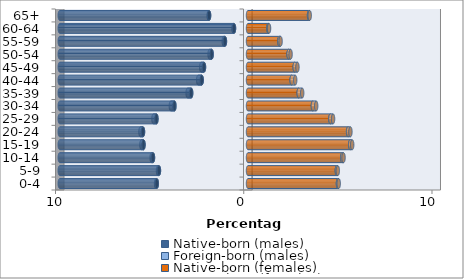
| Category | Native-born (males) | Foreign-born (males) | Native-born (females) | Foreign-born (females) |
|---|---|---|---|---|
| 0-4 | -4.845 | -0.04 | 4.778 | 0.042 |
| 5-9 | -4.73 | -0.051 | 4.719 | 0.052 |
| 10-14 | -5.048 | -0.071 | 5.005 | 0.071 |
| 15-19 | -5.551 | -0.111 | 5.429 | 0.106 |
| 20-24 | -5.578 | -0.137 | 5.316 | 0.125 |
| 25-29 | -4.864 | -0.159 | 4.376 | 0.143 |
| 30-34 | -3.909 | -0.189 | 3.448 | 0.174 |
| 35-39 | -3.019 | -0.189 | 2.694 | 0.184 |
| 40-44 | -2.459 | -0.188 | 2.32 | 0.188 |
| 45-49 | -2.338 | -0.149 | 2.481 | 0.146 |
| 50-54 | -1.93 | -0.111 | 2.156 | 0.106 |
| 55-59 | -1.225 | -0.064 | 1.666 | 0.066 |
| 60-64 | -0.743 | -0.029 | 1.082 | 0.035 |
| 65+ | -2.068 | -0.021 | 3.242 | 0.036 |